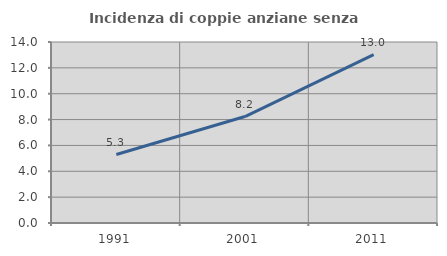
| Category | Incidenza di coppie anziane senza figli  |
|---|---|
| 1991.0 | 5.294 |
| 2001.0 | 8.233 |
| 2011.0 | 13.029 |